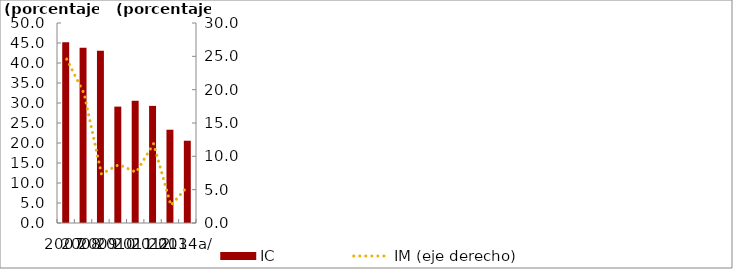
| Category | IC |
|---|---|
| 2007 | 45.172 |
| 2008 | 43.802 |
| 2009 | 43.079 |
| 2010 | 29.095 |
| 2011 | 30.558 |
| 2012 | 29.281 |
| 2013 | 23.315 |
| 2014a/ | 20.568 |